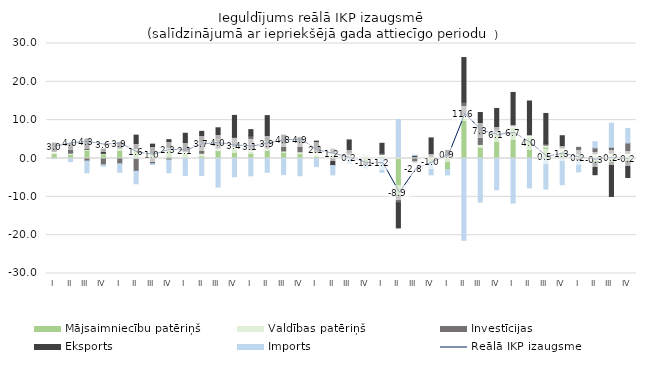
| Category | Mājsaimniecību patēriņš | Valdības patēriņš | Investīcijas | Eksports | Imports |
|---|---|---|---|---|---|
| I | 1.471 | 0.435 | 0.021 | 2.085 | -0.014 |
| II | 1.039 | 0.337 | 1.112 | 1.391 | -0.814 |
| III | 2.12 | 0.288 | -0.668 | 2.703 | -3.069 |
| IV | 1.174 | 0.162 | -1.666 | 1.145 | -0.326 |
| I | 2.517 | 0.209 | -1.374 | 1.445 | -2.234 |
| II | 2.29 | 0.236 | -3.319 | 3.566 | -3.269 |
| III | 1.009 | 0.329 | -1.382 | 2.41 | -0.187 |
| IV | 2.282 | 0.533 | -0.392 | 2.101 | -3.346 |
| I | 1.274 | 0.589 | 0.265 | 4.455 | -4.419 |
| II | 0.66 | 0.699 | 2.927 | 2.793 | -4.445 |
| III | 2.049 | 0.676 | 2.659 | 2.63 | -7.46 |
| IV | 2.581 | 0.547 | 2.485 | 5.628 | -4.771 |
| I | 1.86 | 0.414 | 3.624 | 1.633 | -4.518 |
| II | 2.365 | 0.32 | 2.069 | 6.43 | -3.612 |
| III | 1.604 | 0.354 | 2.054 | 2.09 | -4.196 |
| IV | 1.243 | 0.516 | 2.689 | 0.977 | -4.508 |
| I | 0.792 | 0.795 | 0.885 | 2.054 | -2.108 |
| II | 0.591 | 0.939 | 0.912 | -1.831 | -2.443 |
| III | 0.049 | 0.954 | 0.657 | 3.184 | -1.25 |
| IV | -1.163 | 0.829 | -0.626 | -0.108 | -0.585 |
| I | 0.483 | 0.599 | 0.343 | 2.54 | -3.586 |
| II | -9.615 | 0.379 | -1.954 | -6.537 | 9.789 |
| III | 0.093 | 0.31 | -0.95 | 0.39 | 0.067 |
| IV | -0.891 | 0.434 | 0.593 | 4.353 | -3.369 |
| I | -2.895 | 0.554 | 0.392 | 1.176 | -1.379 |
| II | 10.516 | 0.77 | 3.439 | 11.611 | -21.347 |
| III | 2.909 | 0.761 | 2.166 | 6.162 | -11.364 |
| IV | 6.328 | 0.521 | 0.833 | 5.375 | -8.162 |
| I | 8.07 | 0.422 | 0.12 | 8.62 | -11.634 |
| II | 5.571 | 0.455 | 0.073 | 8.903 | -7.668 |
| III | 2.943 | 0.538 | 0.373 | 7.897 | -7.971 |
| IV | 1.86 | 0.869 | 0.331 | 2.88 | -6.848 |
| I | -0.113 | 1.143 | 1.775 | -0.404 | -2.994 |
| II | -0.921 | 1.258 | 1.52 | -3.307 | 1.609 |
| III | -0.971 | 1.388 | 1.555 | -8.934 | 6.27 |
| IV | -0.718 | 1.384 | 2.671 | -4.235 | 3.763 |